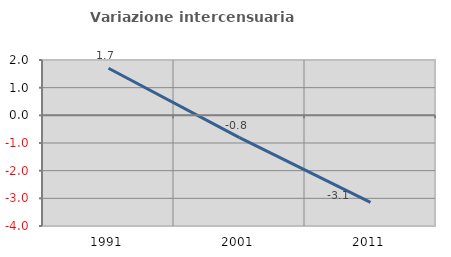
| Category | Variazione intercensuaria annua |
|---|---|
| 1991.0 | 1.703 |
| 2001.0 | -0.805 |
| 2011.0 | -3.147 |